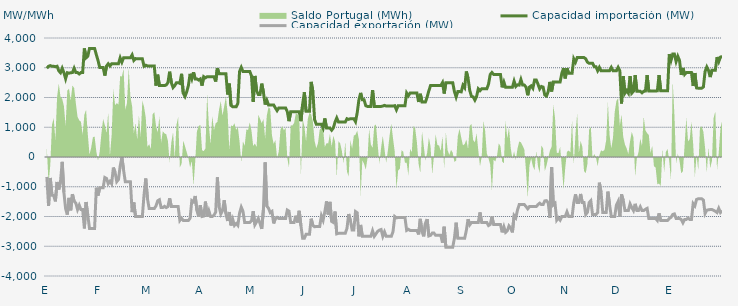
| Category | Capacidad importación (MW) | Capacidad exportación (MW) |
|---|---|---|
| 0 | 2983.333 | -668.75 |
| 1900-01-01 | 3050 | -1645.833 |
| 1900-01-02 | 3070.833 | -704.167 |
| 1900-01-03 | 3050 | -1285.417 |
| 1900-01-04 | 3050 | -1295.833 |
| 1900-01-05 | 3033.333 | -1491.667 |
| 1900-01-06 | 3050 | -839.583 |
| 1900-01-07 | 2895.833 | -1091.667 |
| 1900-01-08 | 2833.333 | -825 |
| 1900-01-09 | 2983.333 | -162.5 |
| 1900-01-10 | 2833.333 | -1191.667 |
| 1900-01-11 | 2631.25 | -1741.667 |
| 1900-01-12 | 2833.333 | -1935.417 |
| 1900-01-13 | 2816.667 | -1375 |
| 1900-01-14 | 2833.333 | -1791.667 |
| 1900-01-15 | 2837.5 | -1250 |
| 1900-01-16 | 2983.333 | -1487.5 |
| 1900-01-17 | 2837.5 | -1550 |
| 1900-01-18 | 2837.5 | -1766.667 |
| 1900-01-19 | 2790.417 | -1620.833 |
| 1900-01-20 | 2837.5 | -1766.667 |
| 1900-01-21 | 2837.5 | -1766.667 |
| 1900-01-22 | 3650 | -2400 |
| 1900-01-23 | 3333.333 | -1512.5 |
| 1900-01-24 | 3387.5 | -1952.083 |
| 1900-01-25 | 3650 | -2400 |
| 1900-01-26 | 3650 | -2400 |
| 1900-01-27 | 3650 | -2400 |
| 1900-01-28 | 3650 | -2400 |
| 1900-01-29 | 3441.667 | -1033.333 |
| 1900-01-30 | 3245.833 | -1295.833 |
| 1900-01-31 | 3012.5 | -1033.333 |
| 1900-02-01 | 3012.5 | -1033.333 |
| 1900-02-02 | 3012.5 | -1033.333 |
| 1900-02-03 | 2737.5 | -689.583 |
| 1900-02-04 | 3058.333 | -720.833 |
| 1900-02-05 | 3133.333 | -900 |
| 1900-02-06 | 3058.333 | -818.75 |
| 1900-02-07 | 3133.333 | -900 |
| 1900-02-08 | 3133.333 | -355 |
| 1900-02-09 | 3133.333 | -512.5 |
| 1900-02-10 | 3133.333 | -829.167 |
| 1900-02-11 | 3133.333 | -756.25 |
| 1900-02-12 | 3333.333 | -302.083 |
| 1900-02-13 | 3187.5 | -12.5 |
| 1900-02-14 | 3333.333 | -441.667 |
| 1900-02-15 | 3333.333 | -833.333 |
| 1900-02-16 | 3333.333 | -833.333 |
| 1900-02-17 | 3333.333 | -833.333 |
| 1900-02-18 | 3333.333 | -833.333 |
| 1900-02-19 | 3433.333 | -1852.083 |
| 1900-02-20 | 3245.833 | -1529.167 |
| 1900-02-21 | 3308.333 | -2000 |
| 1900-02-22 | 3300 | -2000 |
| 1900-02-23 | 3300 | -2000 |
| 1900-02-24 | 3300 | -2000 |
| 1900-02-25 | 3300 | -2000 |
| 1900-02-26 | 3050 | -1266.667 |
| 1900-02-27 | 3085.417 | -722.917 |
| 1900-02-28 | 3062.5 | -1404.167 |
| 1900-02-28 | 3062.5 | -1733.333 |
| 1900-03-01 | 3062.5 | -1733.333 |
| 1900-03-02 | 3062.5 | -1733.333 |
| 1900-03-03 | 3062.5 | -1733.333 |
| 1900-03-04 | 2400 | -1645.833 |
| 1900-03-05 | 2766.667 | -1470.833 |
| 1900-03-06 | 2400 | -1437.5 |
| 1900-03-07 | 2400 | -1700 |
| 1900-03-08 | 2400 | -1700 |
| 1900-03-09 | 2400 | -1658.333 |
| 1900-03-10 | 2420.833 | -1700 |
| 1900-03-11 | 2500 | -1666.667 |
| 1900-03-12 | 2866.667 | -1389.583 |
| 1900-03-13 | 2500 | -1666.667 |
| 1900-03-14 | 2334.167 | -1666.667 |
| 1900-03-15 | 2400 | -1666.667 |
| 1900-03-16 | 2500 | -1666.667 |
| 1900-03-17 | 2500 | -1666.667 |
| 1900-03-18 | 2475 | -2133.333 |
| 1900-03-19 | 2795.833 | -2058.333 |
| 1900-03-20 | 2141.667 | -2133.333 |
| 1900-03-21 | 2033.333 | -2133.333 |
| 1900-03-22 | 2187.5 | -2133.333 |
| 1900-03-23 | 2400 | -2133.333 |
| 1900-03-24 | 2795.833 | -2058.333 |
| 1900-03-25 | 2625 | -1466.667 |
| 1900-03-26 | 2847.826 | -1508.696 |
| 1900-03-27 | 2625 | -1311.25 |
| 1900-03-28 | 2625 | -1797.917 |
| 1900-03-29 | 2587.5 | -2000 |
| 1900-03-30 | 2625 | -1616.667 |
| 1900-03-31 | 2400 | -2000 |
| 1900-04-01 | 2700 | -1985.417 |
| 1900-04-02 | 2660.833 | -1497.917 |
| 1900-04-03 | 2700 | -2000 |
| 1900-04-04 | 2700 | -1808.333 |
| 1900-04-05 | 2700 | -2000 |
| 1900-04-06 | 2700 | -2000 |
| 1900-04-07 | 2700 | -1958.333 |
| 1900-04-08 | 2537.5 | -1850 |
| 1900-04-09 | 2983.333 | -683.333 |
| 1900-04-10 | 2800 | -1664.583 |
| 1900-04-11 | 2800 | -1914.583 |
| 1900-04-12 | 2800 | -1802.083 |
| 1900-04-13 | 2800 | -1454.167 |
| 1900-04-14 | 2800 | -1906.25 |
| 1900-04-15 | 2100 | -2150 |
| 1900-04-16 | 2466.667 | -1850 |
| 1900-04-17 | 1733.333 | -2300 |
| 1900-04-18 | 1687.5 | -2095.833 |
| 1900-04-19 | 1687.5 | -2300 |
| 1900-04-20 | 1687.5 | -2237.5 |
| 1900-04-21 | 1802.083 | -2300 |
| 1900-04-22 | 2875 | -1887.5 |
| 1900-04-23 | 3012.5 | -1687.5 |
| 1900-04-24 | 2875 | -1822.917 |
| 1900-04-25 | 2875 | -2200 |
| 1900-04-26 | 2875 | -2200 |
| 1900-04-27 | 2875 | -2200 |
| 1900-04-28 | 2875 | -2200 |
| 1900-04-29 | 2725 | -2147.917 |
| 1900-04-30 | 1854.167 | -1822.917 |
| 1900-05-01 | 2725 | -2277.083 |
| 1900-05-02 | 2225 | -2177.083 |
| 1900-05-03 | 2100 | -2066.667 |
| 1900-05-04 | 2100 | -2233.333 |
| 1900-05-05 | 2466.667 | -2416.667 |
| 1900-05-06 | 2175 | -1766.667 |
| 1900-05-07 | 1762.5 | -181.25 |
| 1900-05-08 | 1908.333 | -1650 |
| 1900-05-09 | 1750 | -1725 |
| 1900-05-10 | 1750 | -1870.833 |
| 1900-05-11 | 1750 | -1829.167 |
| 1900-05-12 | 1750 | -2233.333 |
| 1900-05-13 | 1650 | -2066.667 |
| 1900-05-14 | 1558.333 | -2029.167 |
| 1900-05-15 | 1650 | -2066.667 |
| 1900-05-16 | 1650 | -2066.667 |
| 1900-05-17 | 1650 | -2066.667 |
| 1900-05-18 | 1650 | -2066.667 |
| 1900-05-19 | 1650 | -2066.667 |
| 1900-05-20 | 1525 | -1783.333 |
| 1900-05-21 | 1204.167 | -1820.833 |
| 1900-05-22 | 1525 | -2200 |
| 1900-05-23 | 1525 | -2200 |
| 1900-05-24 | 1525 | -2200 |
| 1900-05-25 | 1525 | -1975 |
| 1900-05-26 | 1525 | -2200 |
| 1900-05-27 | 1525 | -1808.333 |
| 1900-05-28 | 1204.167 | -2312.5 |
| 1900-05-29 | 1775 | -2733.333 |
| 1900-05-30 | 2175 | -2733.333 |
| 1900-05-31 | 1537.5 | -2600 |
| 1900-06-01 | 1537.5 | -2600 |
| 1900-06-02 | 1537.5 | -2600 |
| 1900-06-03 | 2525 | -2075 |
| 1900-06-04 | 2204.167 | -2300 |
| 1900-06-05 | 1258.333 | -2345.833 |
| 1900-06-06 | 1100 | -2333.333 |
| 1900-06-07 | 1100 | -2333.333 |
| 1900-06-08 | 1100 | -2333.333 |
| 1900-06-09 | 1100 | -1977.083 |
| 1900-06-10 | 975 | -2127.083 |
| 1900-06-11 | 1295.833 | -1841.667 |
| 1900-06-12 | 975 | -1491.667 |
| 1900-06-13 | 975 | -1933.333 |
| 1900-06-14 | 975 | -1508.333 |
| 1900-06-15 | 900 | -2164.583 |
| 1900-06-16 | 975 | -2200 |
| 1900-06-17 | 1175 | -1833.333 |
| 1900-06-18 | 1312.5 | -2583.333 |
| 1900-06-19 | 1175 | -2566.667 |
| 1900-06-20 | 1175 | -2566.667 |
| 1900-06-21 | 1175 | -2566.667 |
| 1900-06-22 | 1175 | -2566.667 |
| 1900-06-23 | 1175 | -2566.667 |
| 1900-06-24 | 1287.5 | -2397.917 |
| 1900-06-25 | 1264.583 | -1916.667 |
| 1900-06-26 | 1287.5 | -2137.5 |
| 1900-06-27 | 1287.5 | -2450 |
| 1900-06-28 | 1287.5 | -2450 |
| 1900-06-29 | 1187.5 | -1833.333 |
| 1900-06-30 | 1487.5 | -1875 |
| 1900-07-01 | 1925 | -2666.667 |
| 1900-07-02 | 2154.167 | -2283.333 |
| 1900-07-03 | 1925 | -2666.667 |
| 1900-07-04 | 1925 | -2666.667 |
| 1900-07-05 | 1725 | -2666.667 |
| 1900-07-06 | 1700 | -2666.667 |
| 1900-07-07 | 1700 | -2666.667 |
| 1900-07-08 | 1700 | -2666.667 |
| 1900-07-09 | 2250 | -2481.25 |
| 1900-07-10 | 1700 | -2666.667 |
| 1900-07-11 | 1700 | -2583.333 |
| 1900-07-12 | 1700 | -2500 |
| 1900-07-13 | 1700 | -2458.333 |
| 1900-07-14 | 1700 | -2437.5 |
| 1900-07-15 | 1712.5 | -2666.667 |
| 1900-07-16 | 1735.417 | -2516.667 |
| 1900-07-17 | 1712.5 | -2666.667 |
| 1900-07-18 | 1712.5 | -2666.667 |
| 1900-07-19 | 1712.5 | -2666.667 |
| 1900-07-20 | 1712.5 | -2666.667 |
| 1900-07-21 | 1712.5 | -2508.333 |
| 1900-07-22 | 1725 | -2000 |
| 1900-07-23 | 1587.5 | -2045.833 |
| 1900-07-24 | 1725 | -2033.333 |
| 1900-07-25 | 1725 | -2033.333 |
| 1900-07-26 | 1725 | -2033.333 |
| 1900-07-27 | 1725 | -2033.333 |
| 1900-07-28 | 1725 | -2033.333 |
| 1900-07-29 | 2150 | -2466.667 |
| 1900-07-30 | 2058.333 | -2429.167 |
| 1900-07-31 | 2150 | -2466.667 |
| 1900-08-01 | 2150 | -2466.667 |
| 1900-08-02 | 2150 | -2466.667 |
| 1900-08-03 | 2150 | -2466.667 |
| 1900-08-04 | 2150 | -2466.667 |
| 1900-08-05 | 1850 | -2602.083 |
| 1900-08-06 | 2125 | -2079.167 |
| 1900-08-07 | 1850 | -2508.333 |
| 1900-08-08 | 1850 | -2666.667 |
| 1900-08-09 | 1850 | -2225 |
| 1900-08-10 | 2016.667 | -2087.5 |
| 1900-08-11 | 2225 | -2654.167 |
| 1900-08-12 | 2400 | -2633.333 |
| 1900-08-13 | 2400 | -2558.333 |
| 1900-08-14 | 2400 | -2558.333 |
| 1900-08-15 | 2400 | -2633.333 |
| 1900-08-16 | 2400 | -2633.333 |
| 1900-08-17 | 2400 | -2633.333 |
| 1900-08-18 | 2400 | -2633.333 |
| 1900-08-19 | 2500 | -2879.167 |
| 1900-08-20 | 2133.333 | -2343.75 |
| 1900-08-21 | 2500 | -3033.333 |
| 1900-08-22 | 2500 | -3033.333 |
| 1900-08-23 | 2500 | -3033.333 |
| 1900-08-24 | 2500 | -3033.333 |
| 1900-08-25 | 2500 | -3033.333 |
| 1900-08-26 | 2200 | -2733.333 |
| 1900-08-27 | 2016.667 | -2208.333 |
| 1900-08-28 | 2200 | -2733.333 |
| 1900-08-29 | 2200 | -2733.333 |
| 1900-08-30 | 2189.583 | -2733.333 |
| 1900-08-31 | 2410.417 | -2733.333 |
| 1900-09-01 | 2329.167 | -2733.333 |
| 1900-09-02 | 2875 | -2466.667 |
| 1900-09-03 | 2645.833 | -2091.667 |
| 1900-09-04 | 2233.333 | -2279.167 |
| 1900-09-05 | 2037.5 | -2200 |
| 1900-09-06 | 2020.833 | -2200 |
| 1900-09-07 | 1912.5 | -2200 |
| 1900-09-08 | 2037.5 | -2200 |
| 1900-09-09 | 2291.667 | -2200 |
| 1900-09-10 | 2229.167 | -1862.5 |
| 1900-09-11 | 2291.667 | -2200 |
| 1900-09-12 | 2291.667 | -2200 |
| 1900-09-13 | 2291.667 | -2200 |
| 1900-09-14 | 2291.667 | -2200 |
| 1900-09-15 | 2447.917 | -2304.167 |
| 1900-09-16 | 2775 | -2266.667 |
| 1900-09-17 | 2841.667 | -2004.167 |
| 1900-09-18 | 2775 | -2266.667 |
| 1900-09-19 | 2775 | -2266.667 |
| 1900-09-20 | 2775 | -2266.667 |
| 1900-09-21 | 2775 | -2266.667 |
| 1900-09-22 | 2775 | -2266.667 |
| 1900-09-23 | 2341.667 | -2533.333 |
| 1900-09-24 | 2518.75 | -2345.833 |
| 1900-09-25 | 2341.667 | -2533.333 |
| 1900-09-26 | 2341.667 | -2481.25 |
| 1900-09-27 | 2341.667 | -2316.667 |
| 1900-09-28 | 2341.667 | -2391.667 |
| 1900-09-29 | 2341.667 | -2533.333 |
| 1900-09-30 | 2550 | -1966.667 |
| 1900-10-01 | 2370.833 | -2041.667 |
| 1900-10-02 | 2425 | -1779.167 |
| 1900-10-03 | 2416.667 | -1600 |
| 1900-10-04 | 2604.167 | -1600 |
| 1900-10-05 | 2416.667 | -1600 |
| 1900-10-06 | 2416.667 | -1600 |
| 1900-10-07 | 2350 | -1666.667 |
| 1900-10-08 | 2075 | -1741.667 |
| 1900-10-09 | 2350 | -1666.667 |
| 1900-10-10 | 2391.667 | -1666.667 |
| 1900-10-11 | 2310.417 | -1666.667 |
| 1900-10-12 | 2587.5 | -1666.667 |
| 1900-10-13 | 2587.5 | -1666.667 |
| 1900-10-14 | 2450 | -1600 |
| 1900-10-15 | 2287.5 | -1552.083 |
| 1900-10-16 | 2370.833 | -1600 |
| 1900-10-17 | 2350 | -1600 |
| 1900-10-18 | 2083.333 | -1475 |
| 1900-10-19 | 2050 | -1466.667 |
| 1900-10-20 | 2200 | -1541.667 |
| 1900-10-21 | 2525 | -2039.583 |
| 1900-10-22 | 2204.167 | -341.667 |
| 1900-10-23 | 2525 | -1608.333 |
| 1900-10-24 | 2525 | -1558.333 |
| 1900-10-25 | 2525 | -2120.833 |
| 1900-10-26 | 2525 | -2043.75 |
| 1900-10-27 | 2525 | -2120.833 |
| 1900-10-28 | 2816.667 | -2000 |
| 1900-10-29 | 2988 | -2000 |
| 1900-10-30 | 2641.667 | -2000 |
| 1900-10-31 | 2983.333 | -1843.75 |
| 1900-11-01 | 2816.667 | -2000 |
| 1900-11-02 | 2816.667 | -2000 |
| 1900-11-03 | 2816.667 | -2000 |
| 1900-11-04 | 3300 | -1533.333 |
| 1900-11-05 | 3187.5 | -1256.25 |
| 1900-11-06 | 3341.667 | -1533.333 |
| 1900-11-07 | 3341.667 | -1533.333 |
| 1900-11-08 | 3341.667 | -1241.667 |
| 1900-11-09 | 3341.667 | -1533.333 |
| 1900-11-10 | 3341.667 | -1533.333 |
| 1900-11-11 | 3300 | -1933.333 |
| 1900-11-12 | 3187.5 | -1858.333 |
| 1900-11-13 | 3150 | -1531.25 |
| 1900-11-14 | 3150 | -1468.75 |
| 1900-11-15 | 3150 | -1933.333 |
| 1900-11-16 | 3037.5 | -1933.333 |
| 1900-11-17 | 3037.5 | -1933.333 |
| 1900-11-18 | 2900 | -1866.667 |
| 1900-11-19 | 3012.5 | -863.042 |
| 1900-11-20 | 2900 | -1193.75 |
| 1900-11-21 | 2900 | -1866.667 |
| 1900-11-22 | 2900 | -1866.667 |
| 1900-11-23 | 2900 | -1866.667 |
| 1900-11-24 | 2900 | -1164.583 |
| 1900-11-25 | 2900 | -1614.583 |
| 1900-11-26 | 3012.5 | -2000 |
| 1900-11-27 | 2900 | -2000 |
| 1900-11-28 | 2900 | -2000 |
| 1900-11-29 | 2900 | -1612.5 |
| 1900-11-30 | 3012.5 | -1495.833 |
| 1900-12-01 | 2900 | -2000 |
| 1900-12-02 | 1800 | -1258.333 |
| 1900-12-03 | 2720.833 | -1458.333 |
| 1900-12-04 | 2145.833 | -1800 |
| 1900-12-05 | 2233.333 | -1800 |
| 1900-12-06 | 2145.833 | -1800 |
| 1900-12-07 | 2720.833 | -1575 |
| 1900-12-08 | 2145.833 | -1697.917 |
| 1900-12-09 | 2208.333 | -1800 |
| 1900-12-10 | 2750 | -1575 |
| 1900-12-11 | 2208.333 | -1800 |
| 1900-12-12 | 2208.333 | -1800 |
| 1900-12-13 | 2208.333 | -1675 |
| 1900-12-14 | 2158.333 | -1800 |
| 1900-12-15 | 2208.333 | -1800 |
| 1900-12-16 | 2216.667 | -1758.333 |
| 1900-12-17 | 2750 | -1727.083 |
| 1900-12-18 | 2216.667 | -2066.667 |
| 1900-12-19 | 2216.667 | -2066.667 |
| 1900-12-20 | 2216.667 | -2066.667 |
| 1900-12-21 | 2216.667 | -2066.667 |
| 1900-12-22 | 2216.667 | -2066.667 |
| 1900-12-23 | 2225 | -2133.333 |
| 1900-12-24 | 2750 | -1893.75 |
| 1900-12-25 | 2225 | -2133.333 |
| 1900-12-26 | 2225 | -2133.333 |
| 1900-12-27 | 2225 | -2133.333 |
| 1900-12-28 | 2225 | -2133.333 |
| 1900-12-29 | 2225 | -2133.333 |
| 1900-12-30 | 3458.333 | -2066.667 |
| 1900-12-31 | 3245.833 | -2029.167 |
| 1901-01-01 | 3458.333 | -1933.333 |
| 1901-01-02 | 3458.333 | -1912.5 |
| 1901-01-03 | 3208.333 | -2066.667 |
| 1901-01-04 | 3383.333 | -2066.667 |
| 1901-01-05 | 3245.833 | -2066.667 |
| 1901-01-06 | 2758.333 | -2100 |
| 1901-01-07 | 2991.667 | -2212.5 |
| 1901-01-08 | 2775 | -2100 |
| 1901-01-09 | 2837.5 | -2100 |
| 1901-01-10 | 2837.5 | -2050 |
| 1901-01-11 | 2837.5 | -2100 |
| 1901-01-12 | 2837.5 | -2100 |
| 1901-01-13 | 2387.5 | -1566.667 |
| 1901-01-14 | 2822.917 | -1641.667 |
| 1901-01-15 | 2320.833 | -1427.083 |
| 1901-01-16 | 2312.5 | -1404.167 |
| 1901-01-17 | 2312.5 | -1404.167 |
| 1901-01-18 | 2312.5 | -1404.167 |
| 1901-01-19 | 2354.167 | -1445.833 |
| 1901-01-20 | 2875 | -1900 |
| 1901-01-21 | 3027.083 | -1787.5 |
| 1901-01-22 | 2912.5 | -1775 |
| 1901-01-23 | 2687.5 | -1766.667 |
| 1901-01-24 | 2912.5 | -1766.667 |
| 1901-01-25 | 2912.5 | -1791.667 |
| 1901-01-26 | 2912.5 | -1825 |
| 1901-01-27 | 3358.333 | -1866.667 |
| 1901-01-28 | 3202.083 | -1725 |
| 1901-01-29 | 3358.333 | -1866.667 |
| 1901-01-30 | 3379.167 | -1802.083 |